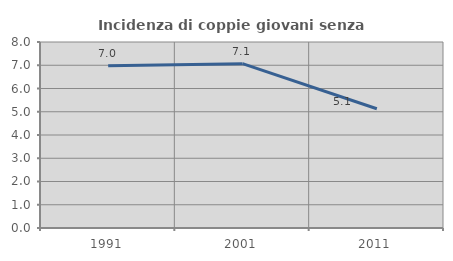
| Category | Incidenza di coppie giovani senza figli |
|---|---|
| 1991.0 | 6.978 |
| 2001.0 | 7.068 |
| 2011.0 | 5.13 |